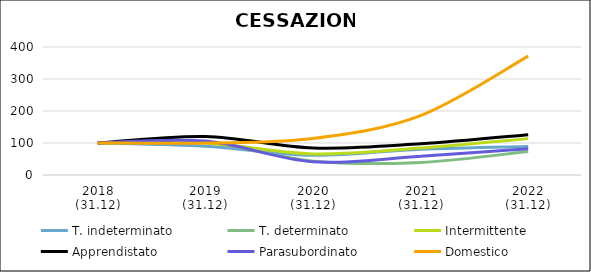
| Category | T. indeterminato | T. determinato | Intermittente | Apprendistato | Parasubordinato | Domestico |
|---|---|---|---|---|---|---|
| 2018
(31.12) | 100 | 100 | 100 | 100 | 100 | 100 |
| 2019
(31.12) | 89.975 | 102.473 | 100.172 | 120.408 | 105.882 | 100 |
| 2020
(31.12) | 61.481 | 43.304 | 65.835 | 84.524 | 41.176 | 114.286 |
| 2021
(31.12) | 80.346 | 39.368 | 84.337 | 97.449 | 58.824 | 185.714 |
| 2022
(31.12) | 89.086 | 73.581 | 113.683 | 125.85 | 82.353 | 371.429 |